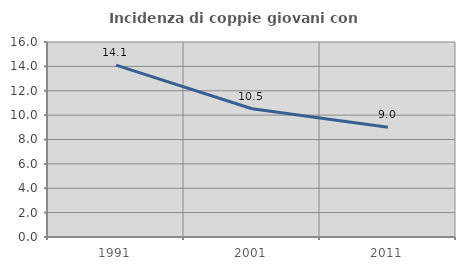
| Category | Incidenza di coppie giovani con figli |
|---|---|
| 1991.0 | 14.105 |
| 2001.0 | 10.526 |
| 2011.0 | 9.001 |